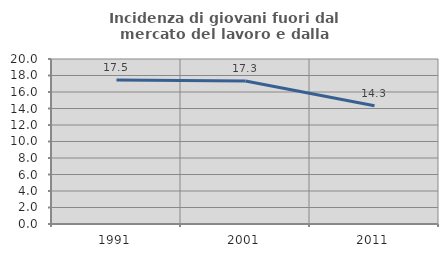
| Category | Incidenza di giovani fuori dal mercato del lavoro e dalla formazione  |
|---|---|
| 1991.0 | 17.451 |
| 2001.0 | 17.334 |
| 2011.0 | 14.331 |